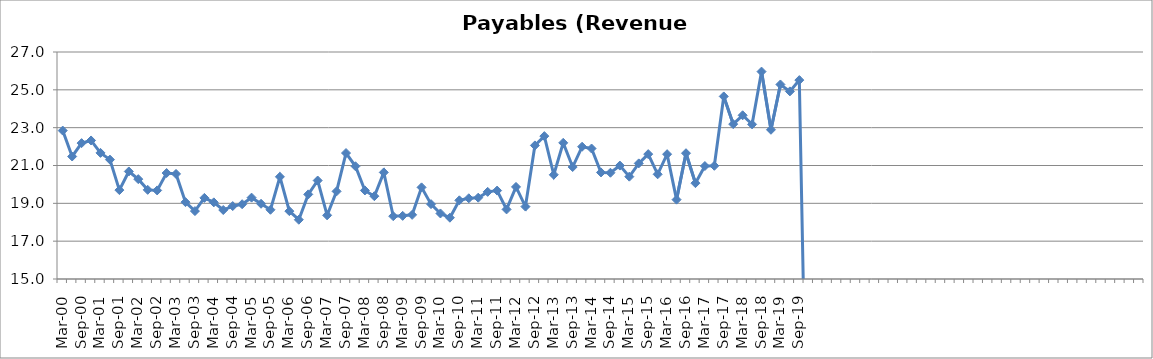
| Category | Payables (Revenue Days) |
|---|---|
| Mar-00 | 22.846 |
| Jun-00 | 21.476 |
| Sep-00 | 22.182 |
| Dec-00 | 22.324 |
| Mar-01 | 21.667 |
| Jun-01 | 21.309 |
| Sep-01 | 19.7 |
| Dec-01 | 20.685 |
| Mar-02 | 20.278 |
| Jun-02 | 19.713 |
| Sep-02 | 19.683 |
| Dec-02 | 20.601 |
| Mar-03 | 20.554 |
| Jun-03 | 19.063 |
| Sep-03 | 18.59 |
| Dec-03 | 19.288 |
| Mar-04 | 19.051 |
| Jun-04 | 18.647 |
| Sep-04 | 18.856 |
| Dec-04 | 18.953 |
| Mar-05 | 19.301 |
| Jun-05 | 18.976 |
| Sep-05 | 18.66 |
| Dec-05 | 20.401 |
| Mar-06 | 18.588 |
| Jun-06 | 18.133 |
| Sep-06 | 19.473 |
| Dec-06 | 20.206 |
| Mar-07 | 18.367 |
| Jun-07 | 19.634 |
| Sep-07 | 21.659 |
| Dec-07 | 20.96 |
| Mar-08 | 19.681 |
| Jun-08 | 19.377 |
| Sep-08 | 20.633 |
| Dec-08 | 18.32 |
| Mar-09 | 18.338 |
| Jun-09 | 18.391 |
| Sep-09 | 19.844 |
| Dec-09 | 18.957 |
| Mar-10 | 18.465 |
| Jun-10 | 18.24 |
| Sep-10 | 19.158 |
| Dec-10 | 19.267 |
| Mar-11 | 19.298 |
| Jun-11 | 19.606 |
| Sep-11 | 19.675 |
| Dec-11 | 18.678 |
| Mar-12 | 19.868 |
| Jun-12 | 18.828 |
| Sep-12 | 22.062 |
| Dec-12 | 22.553 |
| Mar-13 | 20.509 |
| Jun-13 | 22.198 |
| Sep-13 | 20.919 |
| Dec-13 | 21.992 |
| Mar-14 | 21.897 |
| Jun-14 | 20.632 |
| Sep-14 | 20.617 |
| Dec-14 | 20.996 |
| Mar-15 | 20.41 |
| Jun-15 | 21.112 |
| Sep-15 | 21.601 |
| Dec-15 | 20.535 |
| Mar-16 | 21.598 |
| Jun-16 | 19.194 |
| Sep-16 | 21.649 |
| Dec-16 | 20.066 |
| Mar-17 | 20.972 |
| Jun-17 | 20.984 |
| Sep-17 | 24.651 |
| Dec-17 | 23.187 |
| Mar-18 | 23.655 |
| Jun-18 | 23.175 |
| Sep-18 | 25.965 |
| Dec-18 | 22.889 |
| Mar-19 | 25.283 |
| Jun-19 | 24.918 |
| Sep-19 | 25.514 |